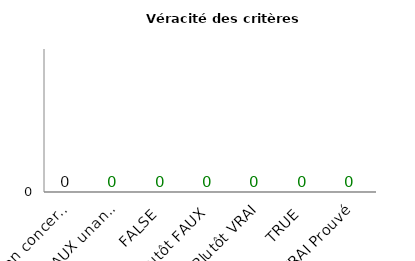
| Category | Series 0 |
|---|---|
| Non concernée | 0 |
| FAUX unanime | 0 |
| FAUX | 0 |
| Plutôt FAUX | 0 |
| Plutôt VRAI | 0 |
| VRAI | 0 |
| VRAI Prouvé | 0 |